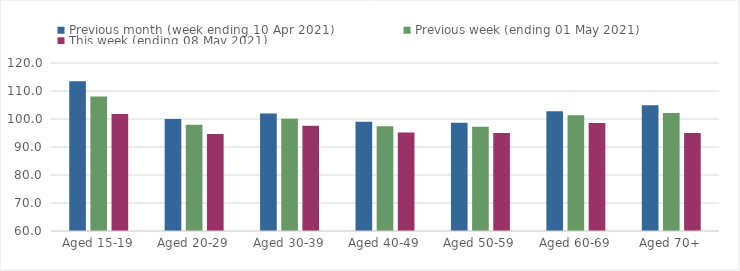
| Category | Previous month (week ending 10 Apr 2021) | Previous week (ending 01 May 2021) | This week (ending 08 May 2021) |
|---|---|---|---|
| Aged 15-19 | 113.46 | 108.02 | 101.77 |
| Aged 20-29 | 99.99 | 97.96 | 94.6 |
| Aged 30-39 | 101.97 | 100.11 | 97.63 |
| Aged 40-49 | 98.98 | 97.42 | 95.17 |
| Aged 50-59 | 98.68 | 97.2 | 94.96 |
| Aged 60-69 | 102.76 | 101.38 | 98.57 |
| Aged 70+ | 104.91 | 102.12 | 94.97 |